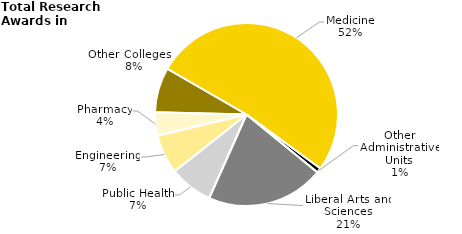
| Category | Series 0 |
|---|---|
| Medicine | 290.2 |
| Other Administrative Units | 4.8 |
| Liberal Arts and Sciences | 116.7 |
| Public Health | 43 |
| Engineering | 38.8 |
| Pharmacy | 23.2 |
| Other Colleges     | 44.6 |